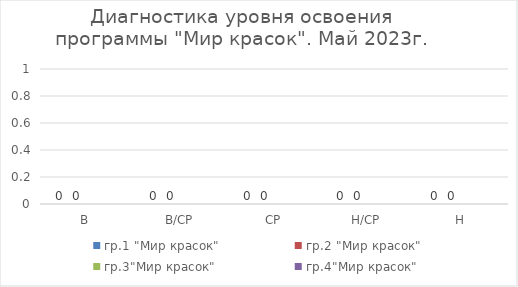
| Category | гр.1 "Мир красок" | гр.2 "Мир красок" | гр.3"Мир красок" | гр.4"Мир красок" |
|---|---|---|---|---|
| В | 0 | 0 | 0 | 0 |
| В/СР | 0 | 0 | 0 | 0 |
| СР | 0 | 0 | 0 | 0 |
| Н/СР | 0 | 0 | 0 | 0 |
| Н | 0 | 0 | 0 | 0 |